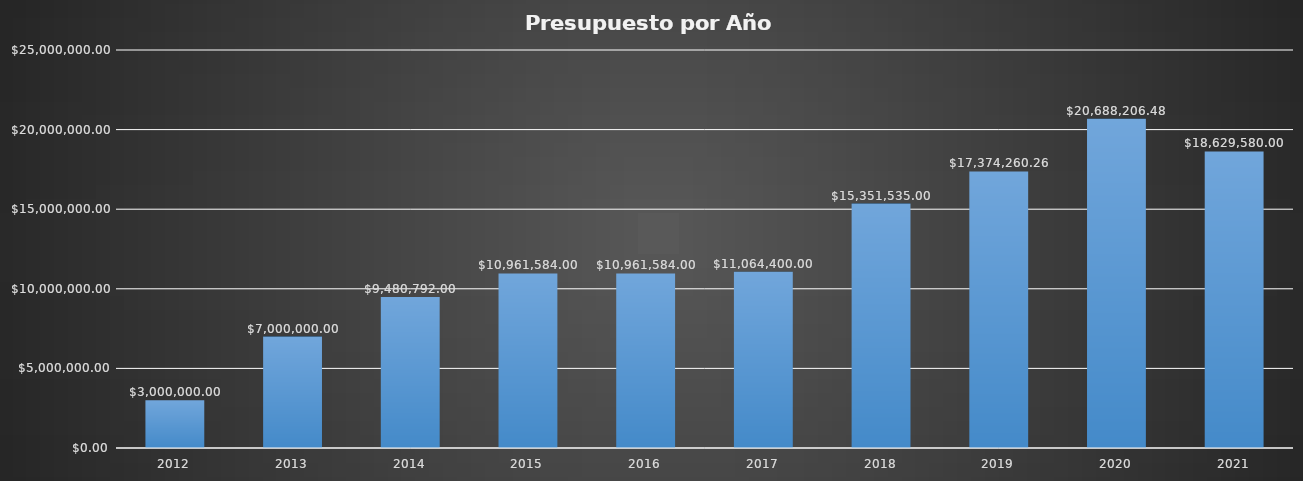
| Category | TOTAL |
|---|---|
| 2012.0 | 3000000 |
| 2013.0 | 7000000 |
| 2014.0 | 9480792 |
| 2015.0 | 10961584 |
| 2016.0 | 10961584 |
| 2017.0 | 11064400 |
| 2018.0 | 15351535 |
| 2019.0 | 17374260.26 |
| 2020.0 | 20688206.48 |
| 2021.0 | 18629580 |